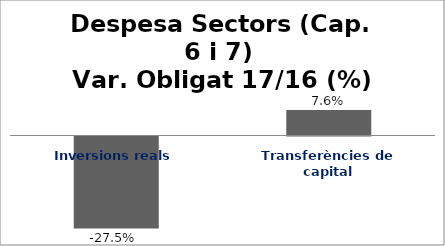
| Category | Series 0 |
|---|---|
| Inversions reals | -0.275 |
| Transferències de capital | 0.076 |